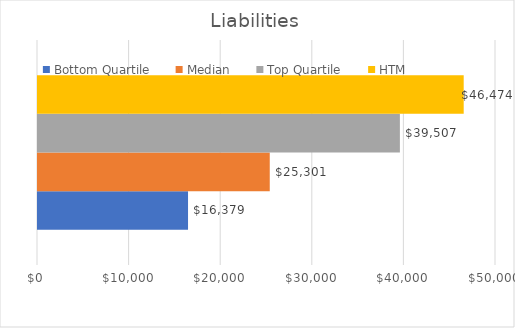
| Category | Bottom Quartile | Median | Top Quartile | HTM  |
|---|---|---|---|---|
| 0 | 16379 | 25301 | 39507 | 46474 |